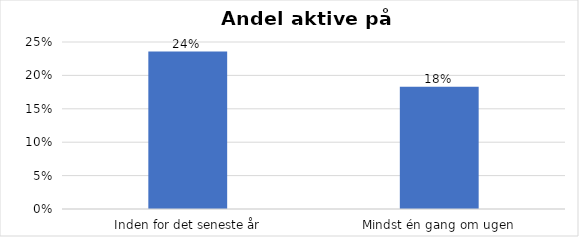
| Category | % |
|---|---|
| Inden for det seneste år | 0.236 |
| Mindst én gang om ugen | 0.183 |